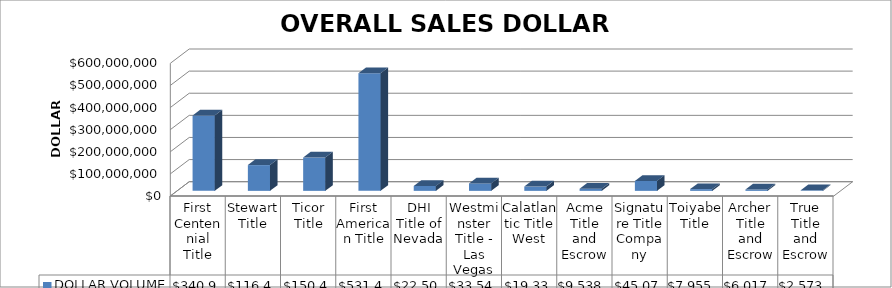
| Category | DOLLAR VOLUME |
|---|---|
| First Centennial Title | 340995986.69 |
| Stewart Title | 116498492.04 |
| Ticor Title | 150441026 |
| First American Title | 531487174.83 |
| DHI Title of Nevada | 22507290 |
| Westminster Title - Las Vegas | 33548817 |
| Calatlantic Title West | 19335642 |
| Acme Title and Escrow | 9538900 |
| Signature Title Company | 45078500 |
| Toiyabe Title | 7955900 |
| Archer Title and Escrow | 6017000 |
| True Title and Escrow | 2573000 |